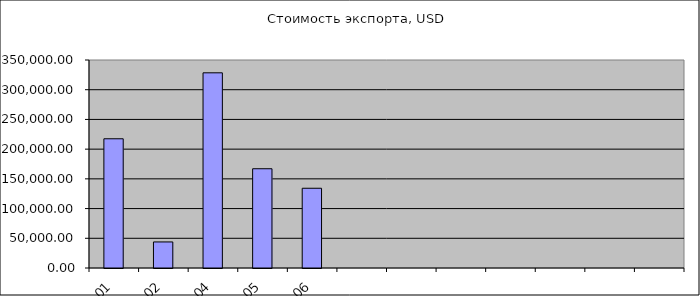
| Category | Стоимость экспорта, USD |
|---|---|
| 2016-01 | 217452.04 |
| 2016-02 | 43840 |
| 2016-04 | 328426.75 |
| 2016-05 | 167030.83 |
| 2016-06 | 134186.22 |